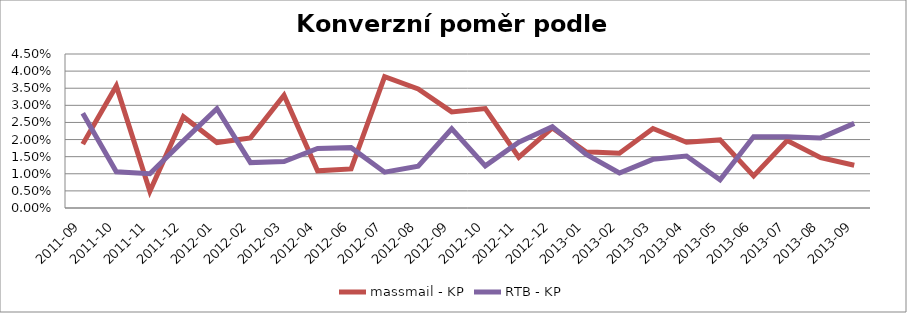
| Category | massmail - KP | RTB - KP |
|---|---|---|
| 2011-09 | 0.019 | 0.028 |
| 2011-10 | 0.036 | 0.011 |
| 2011-11 | 0.005 | 0.01 |
| 2011-12 | 0.027 | 0.02 |
| 2012-01 | 0.019 | 0.029 |
| 2012-02 | 0.02 | 0.013 |
| 2012-03 | 0.033 | 0.014 |
| 2012-04 | 0.011 | 0.017 |
| 2012-06 | 0.011 | 0.018 |
| 2012-07 | 0.038 | 0.01 |
| 2012-08 | 0.035 | 0.012 |
| 2012-09 | 0.028 | 0.023 |
| 2012-10 | 0.029 | 0.012 |
| 2012-11 | 0.015 | 0.019 |
| 2012-12 | 0.023 | 0.024 |
| 2013-01 | 0.016 | 0.016 |
| 2013-02 | 0.016 | 0.01 |
| 2013-03 | 0.023 | 0.014 |
| 2013-04 | 0.019 | 0.015 |
| 2013-05 | 0.02 | 0.008 |
| 2013-06 | 0.009 | 0.021 |
| 2013-07 | 0.02 | 0.021 |
| 2013-08 | 0.015 | 0.02 |
| 2013-09 | 0.012 | 0.025 |